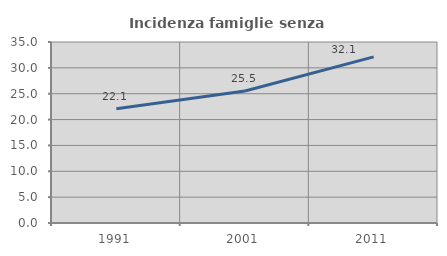
| Category | Incidenza famiglie senza nuclei |
|---|---|
| 1991.0 | 22.104 |
| 2001.0 | 25.515 |
| 2011.0 | 32.118 |